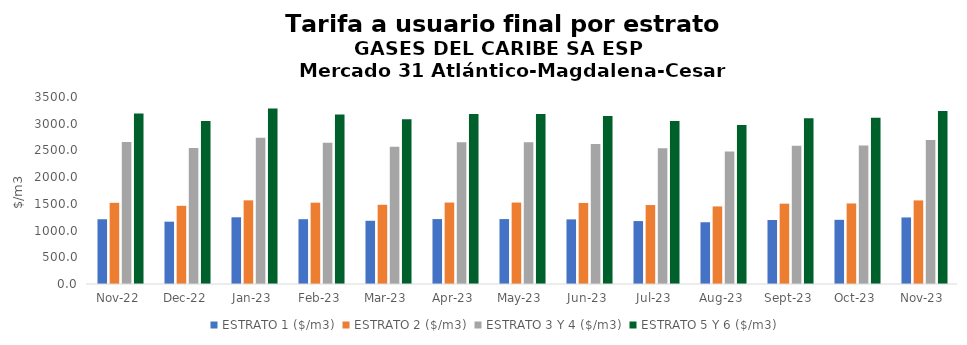
| Category | ESTRATO 1 ($/m3) | ESTRATO 2 ($/m3) | ESTRATO 3 Y 4 ($/m3) | ESTRATO 5 Y 6 ($/m3) |
|---|---|---|---|---|
| 2022-11-01 | 1212.06 | 1519.44 | 2658.31 | 3189.972 |
| 2022-12-01 | 1166.58 | 1463.43 | 2544.24 | 3053.088 |
| 2023-01-01 | 1248.7 | 1565.89 | 2736.03 | 3283.236 |
| 2023-02-01 | 1212.89 | 1521.57 | 2641.83 | 3170.196 |
| 2023-03-01 | 1183.19 | 1482.78 | 2568.94 | 3082.728 |
| 2023-04-01 | 1215.25 | 1524.46 | 2651.33 | 3181.596 |
| 2023-05-01 | 1215.25 | 1524.46 | 2651.33 | 3181.596 |
| 2023-06-01 | 1209.41 | 1517.12 | 2619.03 | 3142.836 |
| 2023-07-01 | 1178 | 1477.97 | 2542.18 | 3050.616 |
| 2023-08-01 | 1155.93 | 1451.92 | 2479.28 | 2975.136 |
| 2023-09-01 | 1198 | 1503.27 | 2586.8 | 3104.16 |
| 2023-10-01 | 1201.13 | 1507.69 | 2594.42 | 3113.304 |
| 2023-11-01 | 1245.69 | 1564.66 | 2697.24 | 3236.688 |